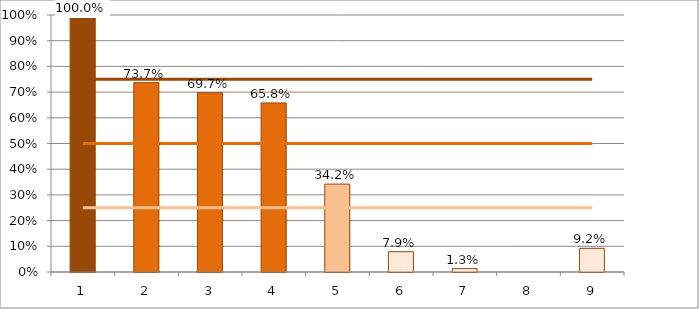
| Category | >=75 | >=50 и <75 | >=25 и <50 | <25 |
|---|---|---|---|---|
| 0 | 1 | 0 | 0 | 0 |
| 1 | 0 | 0.737 | 0 | 0 |
| 2 | 0 | 0.697 | 0 | 0 |
| 3 | 0 | 0.658 | 0 | 0 |
| 4 | 0 | 0 | 0.342 | 0 |
| 5 | 0 | 0 | 0 | 0.079 |
| 6 | 0 | 0 | 0 | 0.013 |
| 7 | 0 | 0 | 0 | 0 |
| 8 | 0 | 0 | 0 | 0.092 |